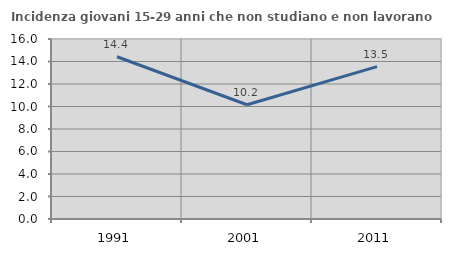
| Category | Incidenza giovani 15-29 anni che non studiano e non lavorano  |
|---|---|
| 1991.0 | 14.421 |
| 2001.0 | 10.158 |
| 2011.0 | 13.546 |